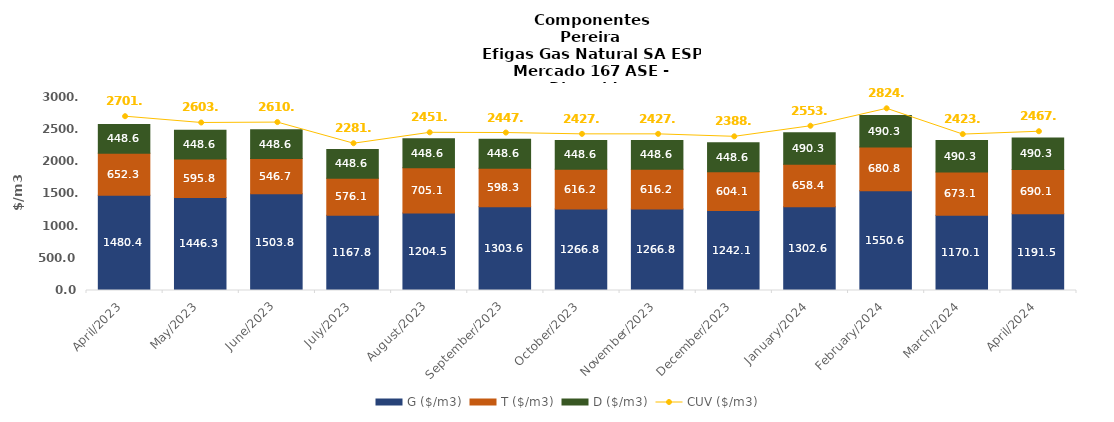
| Category | G ($/m3) | T ($/m3) | D ($/m3) |
|---|---|---|---|
| 2023-04-01 | 1480.39 | 652.25 | 448.635 |
| 2023-05-01 | 1446.347 | 595.782 | 448.635 |
| 2023-06-01 | 1503.75 | 546.731 | 448.635 |
| 2023-07-01 | 1167.85 | 576.067 | 448.635 |
| 2023-08-01 | 1204.533 | 705.123 | 448.635 |
| 2023-09-01 | 1303.571 | 598.275 | 448.635 |
| 2023-10-01 | 1266.828 | 616.197 | 448.635 |
| 2023-11-01 | 1266.828 | 616.197 | 448.635 |
| 2023-12-01 | 1242.144 | 604.124 | 448.635 |
| 2024-01-01 | 1302.583 | 658.407 | 490.269 |
| 2024-02-01 | 1550.602 | 680.767 | 490.269 |
| 2024-03-01 | 1170.084 | 673.093 | 490.269 |
| 2024-04-01 | 1191.522 | 690.074 | 490.269 |